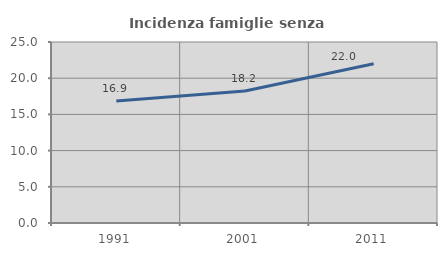
| Category | Incidenza famiglie senza nuclei |
|---|---|
| 1991.0 | 16.865 |
| 2001.0 | 18.22 |
| 2011.0 | 21.999 |